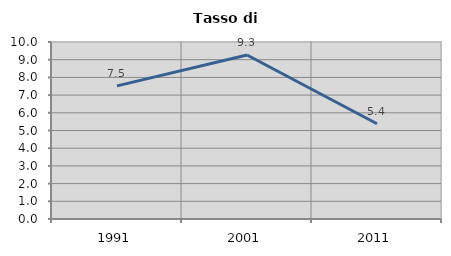
| Category | Tasso di disoccupazione   |
|---|---|
| 1991.0 | 7.522 |
| 2001.0 | 9.266 |
| 2011.0 | 5.381 |